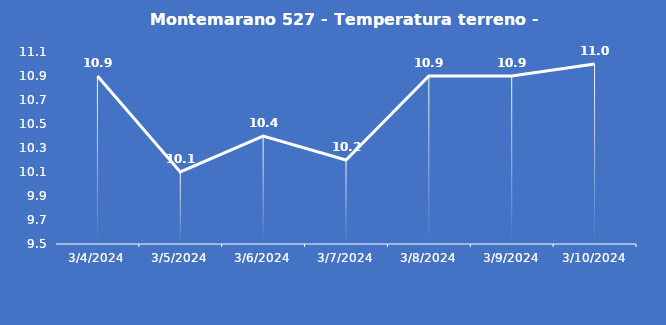
| Category | Montemarano 527 - Temperatura terreno - Grezzo (°C) |
|---|---|
| 3/4/24 | 10.9 |
| 3/5/24 | 10.1 |
| 3/6/24 | 10.4 |
| 3/7/24 | 10.2 |
| 3/8/24 | 10.9 |
| 3/9/24 | 10.9 |
| 3/10/24 | 11 |